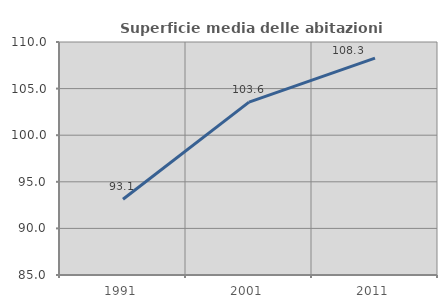
| Category | Superficie media delle abitazioni occupate |
|---|---|
| 1991.0 | 93.127 |
| 2001.0 | 103.552 |
| 2011.0 | 108.278 |